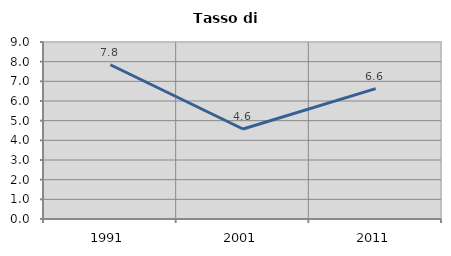
| Category | Tasso di disoccupazione   |
|---|---|
| 1991.0 | 7.843 |
| 2001.0 | 4.575 |
| 2011.0 | 6.63 |